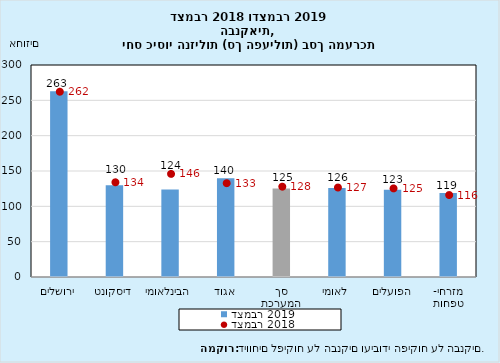
| Category | דצמבר 2019 |
|---|---|
| ירושלים | 262.871 |
| דיסקונט | 130 |
| הבינלאומי | 123.919 |
| אגוד | 139.737 |
| סך המערכת | 125.254 |
| לאומי | 125.968 |
| הפועלים | 123.492 |
| מזרחי- טפחות | 118.978 |